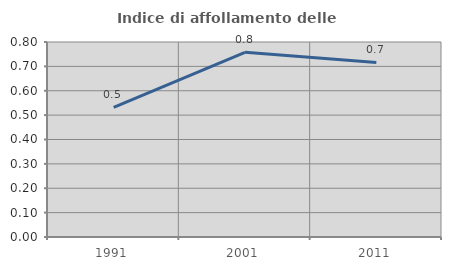
| Category | Indice di affollamento delle abitazioni  |
|---|---|
| 1991.0 | 0.532 |
| 2001.0 | 0.758 |
| 2011.0 | 0.716 |